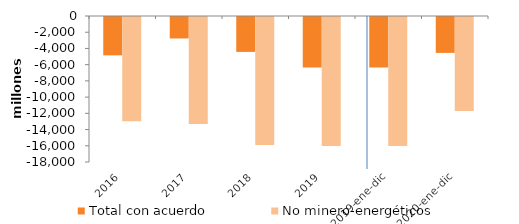
| Category | Total con acuerdo | No minero-energéticos |
|---|---|---|
| 2016 | -4727.12 | -12837.838 |
| 2017 | -2647.531 | -13176.563 |
| 2018 | -4305.189 | -15779.954 |
| 2019 | -6228.931 | -15903.35 |
| 2019-ene-dic | -6228.931 | -15903.35 |
| 2020-ene-dic | -4425.178 | -11591.545 |